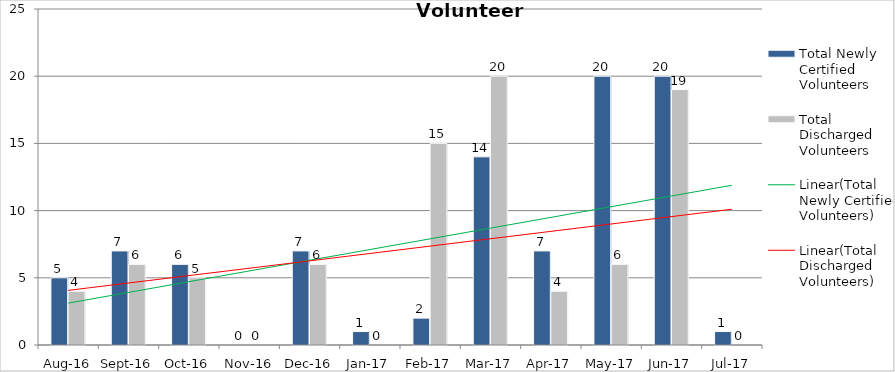
| Category | Total Newly Certified Volunteers | Total Discharged Volunteers |
|---|---|---|
| Aug-16 | 5 | 4 |
| Sep-16 | 7 | 6 |
| Oct-16 | 6 | 5 |
| Nov-16 | 0 | 0 |
| Dec-16 | 7 | 6 |
| Jan-17 | 1 | 0 |
| Feb-17 | 2 | 15 |
| Mar-17 | 14 | 20 |
| Apr-17 | 7 | 4 |
| May-17 | 20 | 6 |
| Jun-17 | 20 | 19 |
| Jul-17 | 1 | 0 |